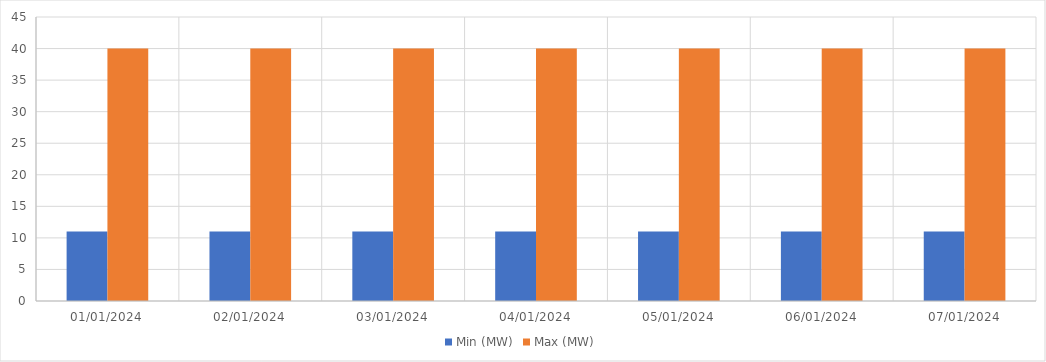
| Category | Min (MW) | Max (MW) |
|---|---|---|
| 01/01/2024 | 11 | 40 |
| 02/01/2024 | 11 | 40 |
| 03/01/2024 | 11 | 40 |
| 04/01/2024 | 11 | 40 |
| 05/01/2024 | 11 | 40 |
| 06/01/2024 | 11 | 40 |
| 07/01/2024 | 11 | 40 |